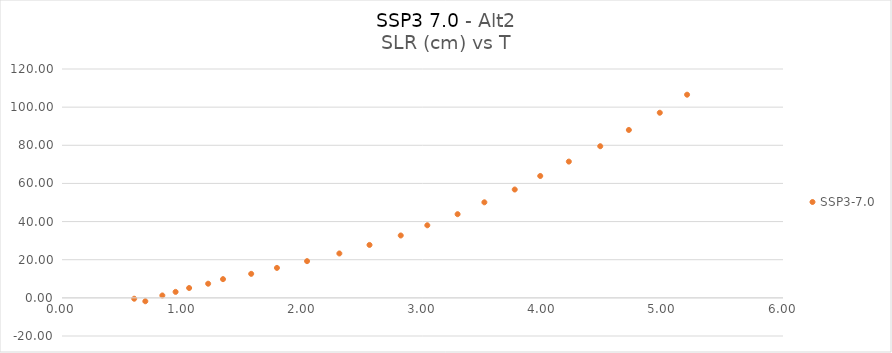
| Category | SSP3-7.0 |
|---|---|
| 0.693400617 | -1.781 |
| 0.600872844 | -0.455 |
| 0.835003234 | 1.253 |
| 0.945258389 | 3.132 |
| 1.057970477 | 5.16 |
| 1.216178519 | 7.412 |
| 1.339886213 | 9.814 |
| 1.574395123 | 12.59 |
| 1.788726787 | 15.708 |
| 2.03935345 | 19.253 |
| 2.308098997 | 23.277 |
| 2.559046546 | 27.751 |
| 2.819027423 | 32.704 |
| 3.040029372 | 38.053 |
| 3.292112505 | 43.874 |
| 3.514897509 | 50.101 |
| 3.767558603 | 56.812 |
| 3.979852391 | 63.907 |
| 4.217738748 | 71.452 |
| 4.479123462 | 79.513 |
| 4.717249217 | 88.032 |
| 4.97471665 | 97.064 |
| 5.201700983 | 106.527 |